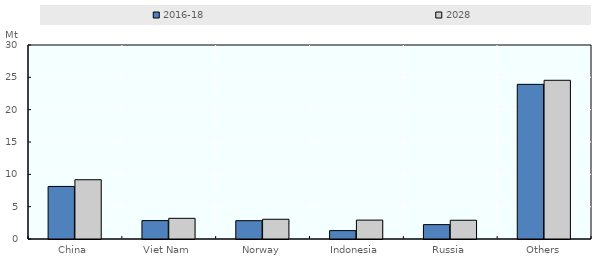
| Category | 2016-18 | 2028 |
|---|---|---|
| China | 8.13 | 9.164 |
| Viet Nam | 2.846 | 3.197 |
| Norway | 2.83 | 3.049 |
| Indonesia | 1.295 | 2.922 |
| Russia | 2.224 | 2.899 |
| Others | 23.916 | 24.542 |